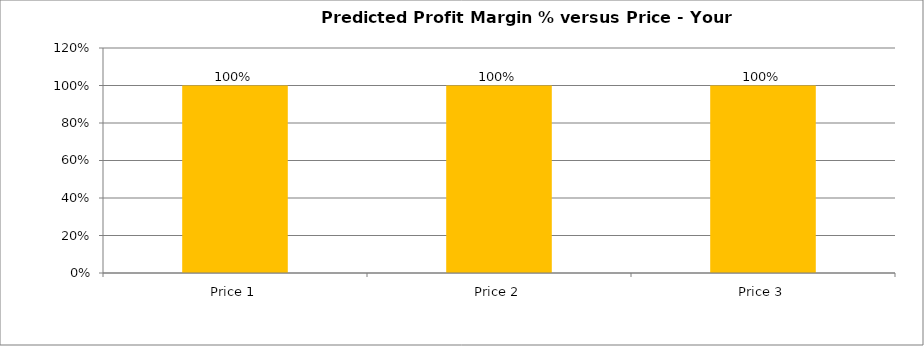
| Category | Predicted Margin % |
|---|---|
| Price 1 | 1 |
| Price 2 | 1 |
| Price 3 | 1 |